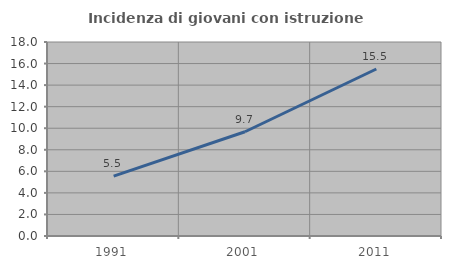
| Category | Incidenza di giovani con istruzione universitaria |
|---|---|
| 1991.0 | 5.549 |
| 2001.0 | 9.675 |
| 2011.0 | 15.493 |